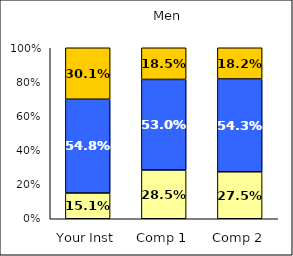
| Category | Low Civic Awareness | Average Civic Awareness | High Civic Awareness |
|---|---|---|---|
| Your Inst | 0.151 | 0.548 | 0.301 |
| Comp 1 | 0.285 | 0.53 | 0.185 |
| Comp 2 | 0.275 | 0.543 | 0.182 |